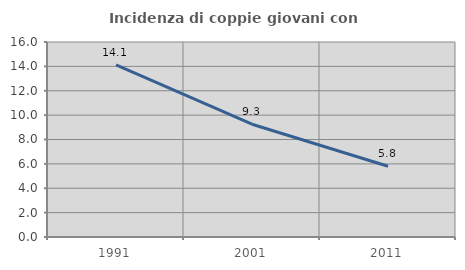
| Category | Incidenza di coppie giovani con figli |
|---|---|
| 1991.0 | 14.114 |
| 2001.0 | 9.254 |
| 2011.0 | 5.806 |